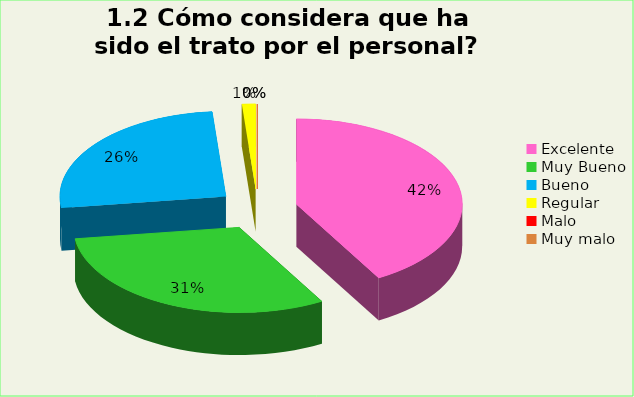
| Category | Series 0 |
|---|---|
| Excelente | 0.417 |
| Muy Bueno | 0.311 |
| Bueno  | 0.258 |
| Regular  | 0.013 |
| Malo  | 0 |
| Muy malo  | 0 |